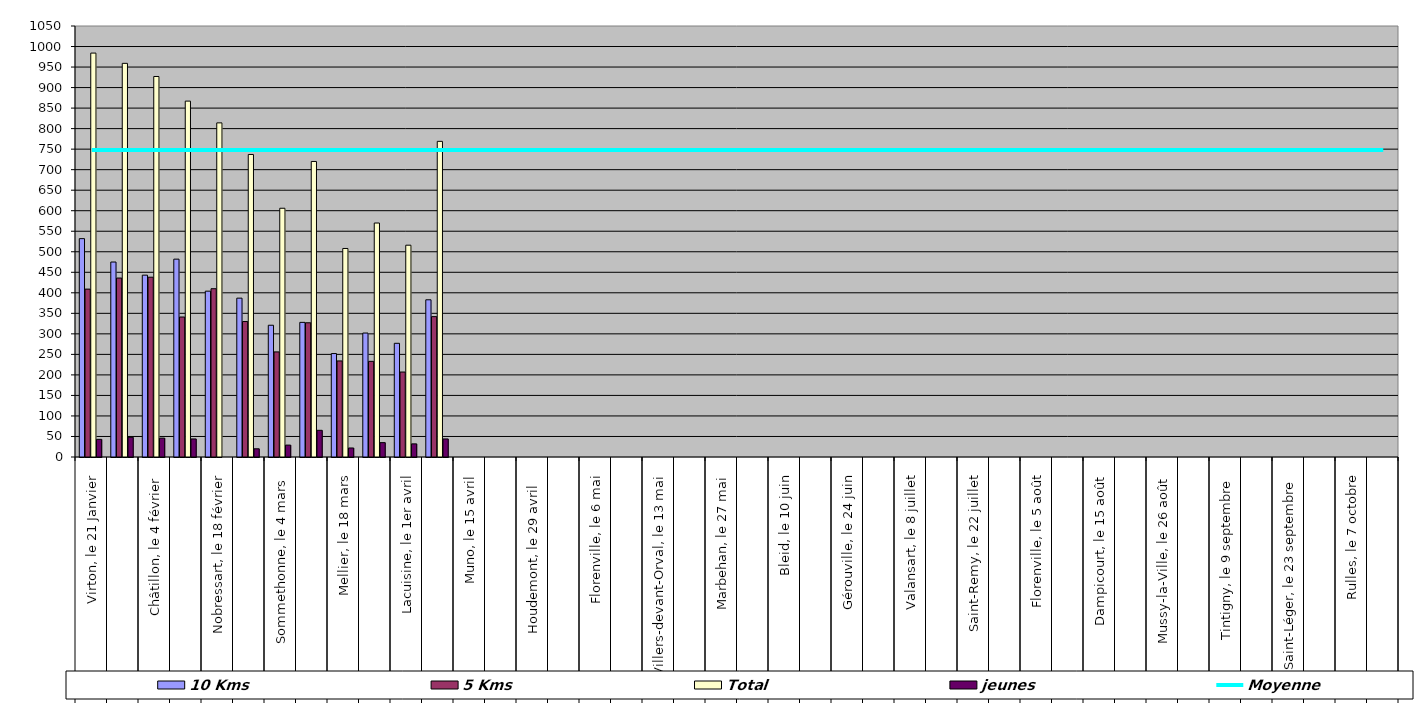
| Category | 10 Kms | 5 Kms | Total | jeunes |
|---|---|---|---|---|
| 0 | 532 | 409 | 984 | 43 |
| 1 | 475 | 436 | 959 | 48 |
| 2 | 443 | 438 | 927 | 46 |
| 3 | 482 | 341 | 867 | 44 |
| 4 | 404 | 410 | 814 | 0 |
| 5 | 387 | 330 | 737 | 20 |
| 6 | 321 | 256 | 606 | 29 |
| 7 | 328 | 327 | 720 | 65 |
| 8 | 252 | 234 | 508 | 22 |
| 9 | 302 | 233 | 570 | 35 |
| 10 | 277 | 207 | 516 | 32 |
| 11 | 383 | 342 | 769 | 44 |
| 12 | 0 | 0 | 0 | 0 |
| 13 | 0 | 0 | 0 | 0 |
| 14 | 0 | 0 | 0 | 0 |
| 15 | 0 | 0 | 0 | 0 |
| 16 | 0 | 0 | 0 | 0 |
| 17 | 0 | 0 | 0 | 0 |
| 18 | 0 | 0 | 0 | 0 |
| 19 | 0 | 0 | 0 | 0 |
| 20 | 0 | 0 | 0 | 0 |
| 21 | 0 | 0 | 0 | 0 |
| 22 | 0 | 0 | 0 | 0 |
| 23 | 0 | 0 | 0 | 0 |
| 24 | 0 | 0 | 0 | 0 |
| 25 | 0 | 0 | 0 | 0 |
| 26 | 0 | 0 | 0 | 0 |
| 27 | 0 | 0 | 0 | 0 |
| 28 | 0 | 0 | 0 | 0 |
| 29 | 0 | 0 | 0 | 0 |
| 30 | 0 | 0 | 0 | 0 |
| 31 | 0 | 0 | 0 | 0 |
| 32 | 0 | 0 | 0 | 0 |
| 33 | 0 | 0 | 0 | 0 |
| 34 | 0 | 0 | 0 | 0 |
| 35 | 0 | 0 | 0 | 0 |
| 36 | 0 | 0 | 0 | 0 |
| 37 | 0 | 0 | 0 | 0 |
| 38 | 0 | 0 | 0 | 0 |
| 39 | 0 | 0 | 0 | 0 |
| 40 | 0 | 0 | 0 | 0 |
| 41 | 0 | 0 | 0 | 0 |